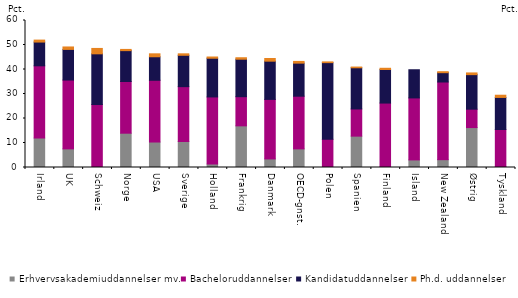
| Category | Erhvervsakademiuddannelser mv. | Bacheloruddannelser | Kandidatuddannelser | Ph.d. uddannelser |
|---|---|---|---|---|
| Irland | 12 | 29.5 | 9.7 | 0.8 |
| UK | 7.6 | 28.1 | 12.5 | 1 |
| Schweiz | 0 | 25.7 | 20.7 | 2.2 |
| Norge | 14 | 21.1 | 12.6 | 0.5 |
| USA | 10.4 | 25.2 | 9.6 | 1.2 |
| Sverige | 10.6 | 22.4 | 12.8 | 0.6 |
| Holland | 1.4 | 27.4 | 15.8 | 0.5 |
| Frankrig | 17 | 11.9 | 15.3 | 0.6 |
| Danmark | 3.5 | 24.3 | 15.6 | 1.1 |
| OECD-gnst. | 7.6 | 21.5 | 13.5 | 0.7 |
| Polen | 0 | 11.5 | 31.3 | 0.3 |
| Spanien | 12.8 | 11.1 | 16.8 | 0.3 |
| Finland | 0.3 | 26 | 13.7 | 0.5 |
| Island | 3.1 | 25.3 | 11.5 | 0 |
| New Zealand | 3.2 | 31.7 | 3.8 | 0.4 |
| Østrig | 16.3 | 7.5 | 14.1 | 0.7 |
| Tyskland | 0.4 | 15.1 | 13.1 | 0.9 |